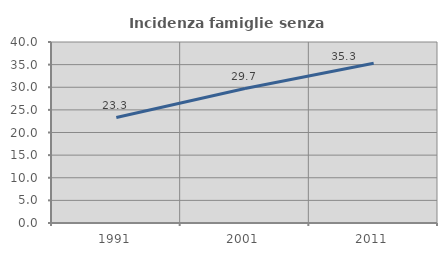
| Category | Incidenza famiglie senza nuclei |
|---|---|
| 1991.0 | 23.304 |
| 2001.0 | 29.705 |
| 2011.0 | 35.286 |